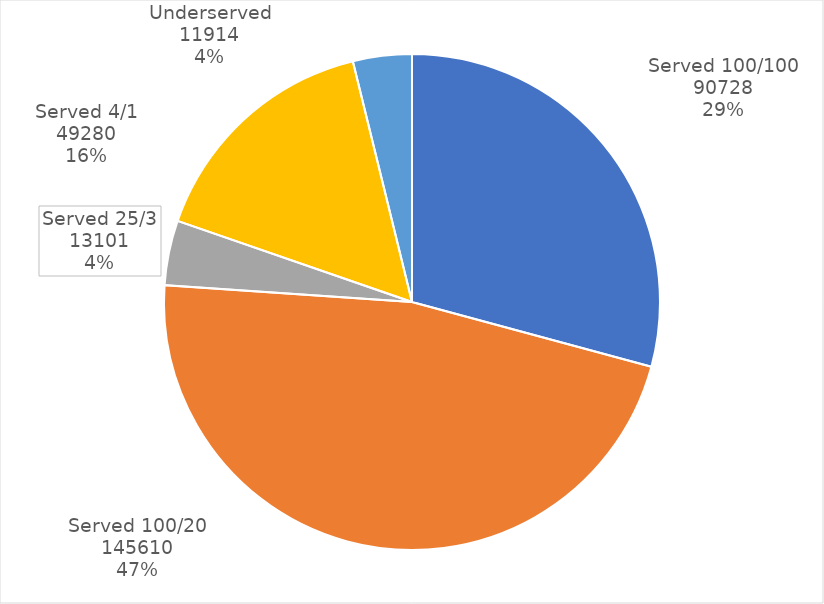
| Category | Series 0 |
|---|---|
| Served 100/100 | 90728 |
| Served 100/20 | 145610 |
| Served 25/3 | 13101 |
| Served 4/1 | 49280 |
| Underserved | 11914 |